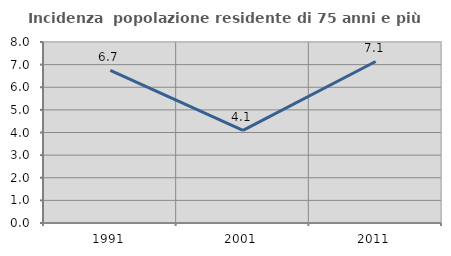
| Category | Incidenza  popolazione residente di 75 anni e più |
|---|---|
| 1991.0 | 6.747 |
| 2001.0 | 4.093 |
| 2011.0 | 7.14 |